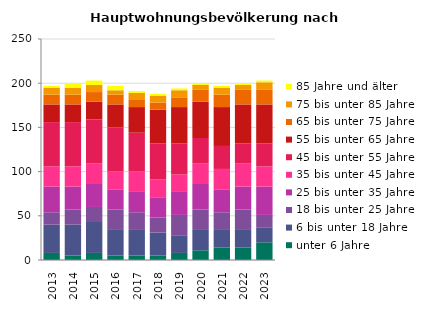
| Category | unter 6 Jahre | 6 bis unter 18 Jahre | 18 bis unter 25 Jahre | 25 bis unter 35 Jahre | 35 bis unter 45 Jahre | 45 bis unter 55 Jahre | 55 bis unter 65 Jahre | 65 bis unter 75 Jahre | 75 bis unter 85 Jahre | 85 Jahre und älter |
|---|---|---|---|---|---|---|---|---|---|---|
| 2013.0 | 8 | 32 | 14 | 29 | 23 | 50 | 20 | 11 | 8 | 2 |
| 2014.0 | 5 | 35 | 17 | 26 | 23 | 50 | 20 | 11 | 8 | 5 |
| 2015.0 | 8 | 35 | 17 | 26 | 23 | 50 | 20 | 11 | 8 | 5 |
| 2016.0 | 5 | 29 | 23 | 23 | 20 | 50 | 26 | 11 | 5 | 5 |
| 2017.0 | 5 | 29 | 20 | 23 | 23 | 44 | 29 | 8 | 8 | 2 |
| 2018.0 | 5 | 26 | 17 | 23 | 20 | 41 | 38 | 8 | 8 | 2 |
| 2019.0 | 8 | 20 | 23 | 26 | 20 | 35 | 41 | 11 | 8 | 2 |
| 2020.0 | 11 | 23 | 23 | 29 | 23 | 29 | 41 | 14 | 5 | 2 |
| 2021.0 | 14 | 20 | 20 | 26 | 23 | 26 | 44 | 14 | 8 | 2 |
| 2022.0 | 14 | 20 | 23 | 26 | 26 | 23 | 44 | 17 | 5 | 2 |
| 2023.0 | 20 | 17 | 14 | 32 | 23 | 26 | 44 | 17 | 8 | 2 |